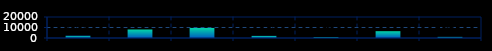
| Category | Series 0 |
|---|---|
| QSAS3H5 | 2218 |
| QSAS3M5 | 8108 |
| QSAS3U5 | 9638 |
| QSAS3Z5 | 2039 |
| QSAS3H6 | 862 |
| QSAS3M6 | 6487 |
| QSAS3U6 | 1091 |